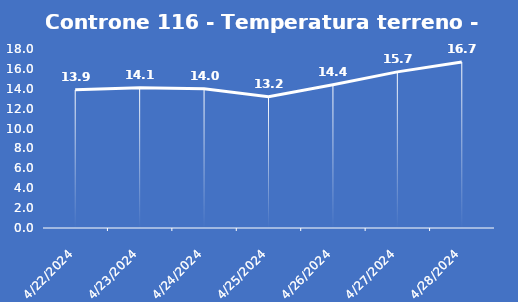
| Category | Controne 116 - Temperatura terreno - Grezzo (°C) |
|---|---|
| 4/22/24 | 13.9 |
| 4/23/24 | 14.1 |
| 4/24/24 | 14 |
| 4/25/24 | 13.2 |
| 4/26/24 | 14.4 |
| 4/27/24 | 15.7 |
| 4/28/24 | 16.7 |